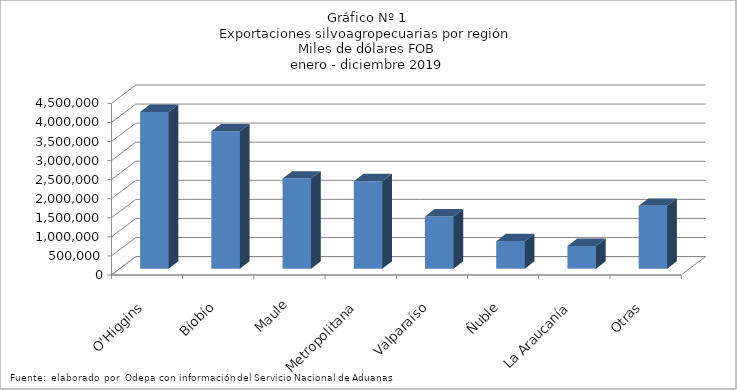
| Category | Series 0 |
|---|---|
| O'Higgins | 4111097.1 |
| Bíobío | 3604449.933 |
| Maule | 2364493.63 |
| Metropolitana | 2293489.281 |
| Valparaíso | 1369627.074 |
| Ñuble | 722264.46 |
| La Araucanía | 598201.961 |
| Otras | 1649271.649 |